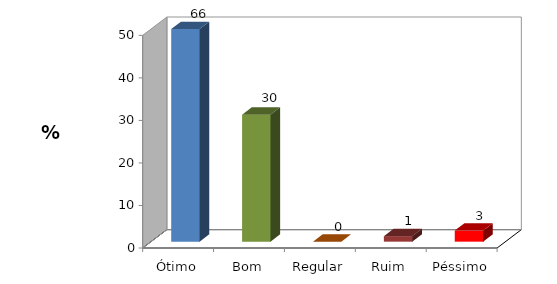
| Category | Series 0 |
|---|---|
| Ótimo | 66.234 |
| Bom | 29.87 |
| Regular | 0 |
| Ruim | 1.299 |
| Péssimo | 2.597 |